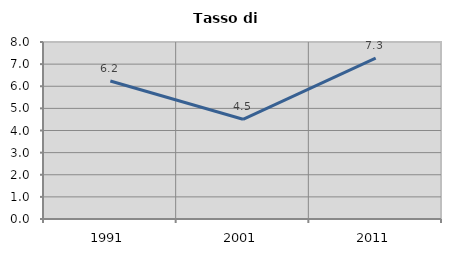
| Category | Tasso di disoccupazione   |
|---|---|
| 1991.0 | 6.238 |
| 2001.0 | 4.508 |
| 2011.0 | 7.273 |